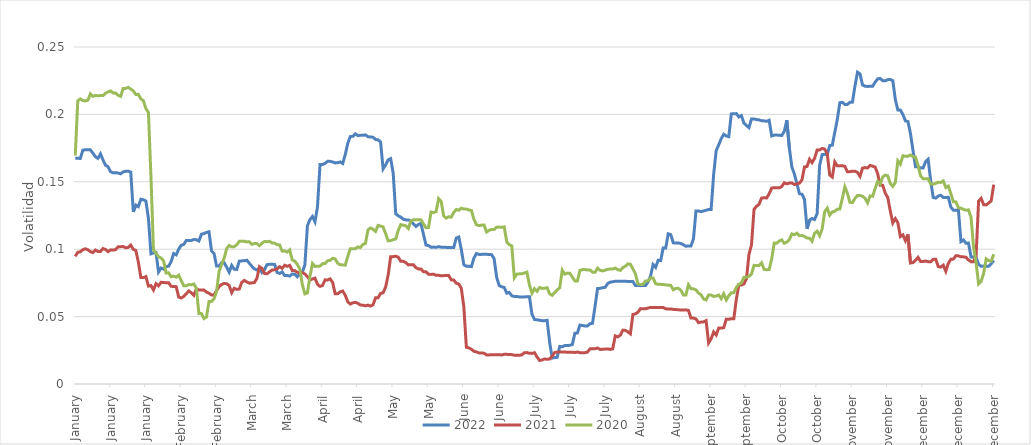
| Category | 2022 | 2021 | 2020 |
|---|---|---|---|
| 2021-01-01 | 0.167 | 0.095 | 0.17 |
| 2021-01-02 | 0.168 | 0.098 | 0.21 |
| 2021-01-03 | 0.167 | 0.098 | 0.212 |
| 2021-01-04 | 0.173 | 0.1 | 0.21 |
| 2021-01-05 | 0.174 | 0.1 | 0.21 |
| 2021-01-06 | 0.174 | 0.1 | 0.211 |
| 2021-01-07 | 0.174 | 0.098 | 0.215 |
| 2021-01-08 | 0.171 | 0.097 | 0.213 |
| 2021-01-09 | 0.169 | 0.099 | 0.214 |
| 2021-01-10 | 0.167 | 0.098 | 0.214 |
| 2021-01-11 | 0.171 | 0.098 | 0.214 |
| 2021-01-12 | 0.166 | 0.1 | 0.214 |
| 2021-01-13 | 0.162 | 0.1 | 0.216 |
| 2021-01-14 | 0.161 | 0.098 | 0.217 |
| 2021-01-15 | 0.157 | 0.099 | 0.217 |
| 2021-01-16 | 0.157 | 0.099 | 0.216 |
| 2021-01-17 | 0.157 | 0.1 | 0.216 |
| 2021-01-18 | 0.156 | 0.102 | 0.214 |
| 2021-01-19 | 0.156 | 0.102 | 0.213 |
| 2021-01-20 | 0.157 | 0.102 | 0.219 |
| 2021-01-21 | 0.158 | 0.101 | 0.219 |
| 2021-01-22 | 0.158 | 0.101 | 0.22 |
| 2021-01-23 | 0.157 | 0.103 | 0.219 |
| 2021-01-24 | 0.128 | 0.1 | 0.217 |
| 2021-01-25 | 0.133 | 0.099 | 0.215 |
| 2021-01-26 | 0.132 | 0.09 | 0.215 |
| 2021-01-27 | 0.137 | 0.079 | 0.211 |
| 2021-01-28 | 0.137 | 0.079 | 0.21 |
| 2021-01-29 | 0.136 | 0.08 | 0.204 |
| 2021-01-30 | 0.123 | 0.073 | 0.201 |
| 2021-01-31 | 0.097 | 0.073 | 0.154 |
| 2021-02-01 | 0.097 | 0.07 | 0.1 |
| 2021-02-02 | 0.098 | 0.074 | 0.097 |
| 2021-02-03 | 0.083 | 0.073 | 0.094 |
| 2021-02-04 | 0.086 | 0.075 | 0.093 |
| 2021-02-05 | 0.085 | 0.075 | 0.091 |
| 2021-02-06 | 0.087 | 0.075 | 0.082 |
| 2021-02-07 | 0.087 | 0.075 | 0.082 |
| 2021-02-08 | 0.091 | 0.073 | 0.08 |
| 2021-02-09 | 0.097 | 0.072 | 0.08 |
| 2021-02-10 | 0.096 | 0.072 | 0.079 |
| 2021-02-11 | 0.1 | 0.064 | 0.081 |
| 2021-02-12 | 0.103 | 0.064 | 0.077 |
| 2021-02-13 | 0.104 | 0.065 | 0.073 |
| 2021-02-14 | 0.106 | 0.067 | 0.073 |
| 2021-02-15 | 0.106 | 0.069 | 0.074 |
| 2021-02-16 | 0.106 | 0.068 | 0.074 |
| 2021-02-17 | 0.107 | 0.066 | 0.074 |
| 2021-02-18 | 0.107 | 0.071 | 0.071 |
| 2021-02-19 | 0.106 | 0.07 | 0.052 |
| 2021-02-20 | 0.111 | 0.07 | 0.052 |
| 2021-02-21 | 0.112 | 0.07 | 0.049 |
| 2021-02-22 | 0.112 | 0.068 | 0.05 |
| 2021-02-23 | 0.113 | 0.067 | 0.061 |
| 2021-02-24 | 0.099 | 0.066 | 0.061 |
| 2021-02-25 | 0.097 | 0.066 | 0.063 |
| 2021-02-26 | 0.088 | 0.069 | 0.069 |
| 2021-02-27 | 0.087 | 0.072 | 0.083 |
| 2021-02-28 | 0.09 | 0.074 | 0.089 |
| 2021-03-01 | 0.09 | 0.075 | 0.093 |
| 2021-03-02 | 0.087 | 0.074 | 0.1 |
| 2021-03-03 | 0.083 | 0.073 | 0.103 |
| 2021-03-04 | 0.088 | 0.068 | 0.102 |
| 2021-03-05 | 0.085 | 0.071 | 0.102 |
| 2021-03-06 | 0.085 | 0.07 | 0.103 |
| 2021-03-07 | 0.091 | 0.07 | 0.106 |
| 2021-03-08 | 0.091 | 0.075 | 0.106 |
| 2021-03-09 | 0.091 | 0.077 | 0.106 |
| 2021-03-10 | 0.092 | 0.076 | 0.105 |
| 2021-03-11 | 0.09 | 0.075 | 0.105 |
| 2021-03-12 | 0.087 | 0.075 | 0.104 |
| 2021-03-13 | 0.085 | 0.075 | 0.104 |
| 2021-03-14 | 0.085 | 0.078 | 0.104 |
| 2021-03-15 | 0.086 | 0.087 | 0.103 |
| 2021-03-16 | 0.083 | 0.086 | 0.104 |
| 2021-03-17 | 0.085 | 0.082 | 0.106 |
| 2021-03-18 | 0.089 | 0.082 | 0.106 |
| 2021-03-19 | 0.089 | 0.083 | 0.106 |
| 2021-03-20 | 0.089 | 0.085 | 0.105 |
| 2021-03-21 | 0.089 | 0.085 | 0.105 |
| 2021-03-22 | 0.083 | 0.085 | 0.103 |
| 2021-03-23 | 0.082 | 0.087 | 0.103 |
| 2021-03-24 | 0.083 | 0.086 | 0.099 |
| 2021-03-25 | 0.08 | 0.088 | 0.099 |
| 2021-03-26 | 0.08 | 0.087 | 0.098 |
| 2021-03-27 | 0.08 | 0.088 | 0.099 |
| 2021-03-28 | 0.082 | 0.084 | 0.092 |
| 2021-03-29 | 0.081 | 0.084 | 0.091 |
| 2021-03-30 | 0.08 | 0.083 | 0.089 |
| 2021-03-31 | 0.082 | 0.083 | 0.085 |
| 2021-04-01 | 0.083 | 0.083 | 0.074 |
| 2021-04-02 | 0.088 | 0.082 | 0.067 |
| 2021-04-03 | 0.117 | 0.08 | 0.068 |
| 2021-04-04 | 0.122 | 0.077 | 0.08 |
| 2021-04-05 | 0.124 | 0.078 | 0.089 |
| 2021-04-06 | 0.12 | 0.079 | 0.087 |
| 2021-04-07 | 0.132 | 0.074 | 0.087 |
| 2021-04-08 | 0.163 | 0.072 | 0.087 |
| 2021-04-09 | 0.163 | 0.073 | 0.089 |
| 2021-04-10 | 0.164 | 0.077 | 0.089 |
| 2021-04-11 | 0.165 | 0.077 | 0.091 |
| 2021-04-12 | 0.165 | 0.078 | 0.092 |
| 2021-04-13 | 0.165 | 0.075 | 0.093 |
| 2021-04-14 | 0.164 | 0.067 | 0.093 |
| 2021-04-15 | 0.164 | 0.067 | 0.09 |
| 2021-04-16 | 0.165 | 0.068 | 0.088 |
| 2021-04-17 | 0.164 | 0.069 | 0.088 |
| 2021-04-18 | 0.17 | 0.066 | 0.088 |
| 2021-04-19 | 0.179 | 0.061 | 0.095 |
| 2021-04-20 | 0.184 | 0.059 | 0.1 |
| 2021-04-21 | 0.184 | 0.06 | 0.1 |
| 2021-04-22 | 0.186 | 0.061 | 0.1 |
| 2021-04-23 | 0.184 | 0.06 | 0.102 |
| 2021-04-24 | 0.185 | 0.059 | 0.101 |
| 2021-04-25 | 0.184 | 0.058 | 0.104 |
| 2021-04-26 | 0.185 | 0.058 | 0.104 |
| 2021-04-27 | 0.183 | 0.059 | 0.114 |
| 2021-04-28 | 0.183 | 0.058 | 0.116 |
| 2021-04-29 | 0.183 | 0.059 | 0.115 |
| 2021-04-30 | 0.181 | 0.064 | 0.113 |
| 2021-05-01 | 0.181 | 0.064 | 0.118 |
| 2021-05-02 | 0.18 | 0.067 | 0.117 |
| 2021-05-03 | 0.16 | 0.068 | 0.117 |
| 2021-05-04 | 0.162 | 0.072 | 0.112 |
| 2021-05-05 | 0.166 | 0.081 | 0.106 |
| 2021-05-06 | 0.167 | 0.094 | 0.106 |
| 2021-05-07 | 0.156 | 0.094 | 0.107 |
| 2021-05-08 | 0.126 | 0.095 | 0.108 |
| 2021-05-09 | 0.125 | 0.094 | 0.114 |
| 2021-05-10 | 0.124 | 0.091 | 0.118 |
| 2021-05-11 | 0.122 | 0.091 | 0.118 |
| 2021-05-12 | 0.122 | 0.09 | 0.117 |
| 2021-05-13 | 0.122 | 0.088 | 0.115 |
| 2021-05-14 | 0.121 | 0.088 | 0.121 |
| 2021-05-15 | 0.119 | 0.089 | 0.122 |
| 2021-05-16 | 0.117 | 0.086 | 0.122 |
| 2021-05-17 | 0.118 | 0.085 | 0.122 |
| 2021-05-18 | 0.119 | 0.085 | 0.122 |
| 2021-05-19 | 0.111 | 0.083 | 0.119 |
| 2021-05-20 | 0.103 | 0.083 | 0.116 |
| 2021-05-21 | 0.103 | 0.081 | 0.116 |
| 2021-05-22 | 0.101 | 0.081 | 0.128 |
| 2021-05-23 | 0.102 | 0.081 | 0.127 |
| 2021-05-24 | 0.101 | 0.081 | 0.128 |
| 2021-05-25 | 0.102 | 0.081 | 0.138 |
| 2021-05-26 | 0.101 | 0.08 | 0.136 |
| 2021-05-27 | 0.101 | 0.08 | 0.125 |
| 2021-05-28 | 0.101 | 0.081 | 0.123 |
| 2021-05-29 | 0.101 | 0.081 | 0.124 |
| 2021-05-30 | 0.101 | 0.077 | 0.124 |
| 2021-05-31 | 0.101 | 0.077 | 0.127 |
| 2021-06-01 | 0.108 | 0.075 | 0.129 |
| 2021-06-02 | 0.109 | 0.074 | 0.129 |
| 2021-06-03 | 0.1 | 0.071 | 0.13 |
| 2021-06-04 | 0.088 | 0.057 | 0.13 |
| 2021-06-05 | 0.087 | 0.027 | 0.13 |
| 2021-06-06 | 0.087 | 0.027 | 0.129 |
| 2021-06-07 | 0.087 | 0.026 | 0.129 |
| 2021-06-08 | 0.093 | 0.024 | 0.122 |
| 2021-06-09 | 0.097 | 0.024 | 0.118 |
| 2021-06-10 | 0.096 | 0.023 | 0.118 |
| 2021-06-11 | 0.096 | 0.023 | 0.118 |
| 2021-06-12 | 0.096 | 0.023 | 0.118 |
| 2021-06-13 | 0.096 | 0.022 | 0.113 |
| 2021-06-14 | 0.096 | 0.022 | 0.114 |
| 2021-06-15 | 0.096 | 0.022 | 0.115 |
| 2021-06-16 | 0.093 | 0.022 | 0.115 |
| 2021-06-17 | 0.079 | 0.022 | 0.116 |
| 2021-06-18 | 0.073 | 0.022 | 0.116 |
| 2021-06-19 | 0.072 | 0.022 | 0.116 |
| 2021-06-20 | 0.072 | 0.022 | 0.117 |
| 2021-06-21 | 0.067 | 0.022 | 0.105 |
| 2021-06-22 | 0.068 | 0.022 | 0.103 |
| 2021-06-23 | 0.065 | 0.022 | 0.102 |
| 2021-06-24 | 0.065 | 0.021 | 0.079 |
| 2021-06-25 | 0.065 | 0.021 | 0.081 |
| 2021-06-26 | 0.065 | 0.021 | 0.082 |
| 2021-06-27 | 0.065 | 0.022 | 0.082 |
| 2021-06-28 | 0.065 | 0.023 | 0.082 |
| 2021-06-29 | 0.065 | 0.023 | 0.083 |
| 2021-06-30 | 0.065 | 0.023 | 0.073 |
| 2021-07-01 | 0.052 | 0.023 | 0.067 |
| 2021-07-02 | 0.048 | 0.023 | 0.071 |
| 2021-07-03 | 0.048 | 0.02 | 0.069 |
| 2021-07-04 | 0.047 | 0.017 | 0.072 |
| 2021-07-05 | 0.047 | 0.018 | 0.071 |
| 2021-07-06 | 0.047 | 0.019 | 0.071 |
| 2021-07-07 | 0.047 | 0.018 | 0.071 |
| 2021-07-08 | 0.031 | 0.019 | 0.067 |
| 2021-07-09 | 0.019 | 0.021 | 0.066 |
| 2021-07-10 | 0.02 | 0.023 | 0.068 |
| 2021-07-11 | 0.02 | 0.024 | 0.07 |
| 2021-07-12 | 0.028 | 0.024 | 0.071 |
| 2021-07-13 | 0.028 | 0.024 | 0.084 |
| 2021-07-14 | 0.028 | 0.024 | 0.082 |
| 2021-07-15 | 0.029 | 0.024 | 0.082 |
| 2021-07-16 | 0.029 | 0.024 | 0.082 |
| 2021-07-17 | 0.029 | 0.024 | 0.079 |
| 2021-07-18 | 0.038 | 0.023 | 0.076 |
| 2021-07-19 | 0.038 | 0.024 | 0.076 |
| 2021-07-20 | 0.044 | 0.023 | 0.084 |
| 2021-07-21 | 0.043 | 0.023 | 0.085 |
| 2021-07-22 | 0.043 | 0.023 | 0.085 |
| 2021-07-23 | 0.043 | 0.024 | 0.085 |
| 2021-07-24 | 0.045 | 0.026 | 0.085 |
| 2021-07-25 | 0.045 | 0.026 | 0.083 |
| 2021-07-26 | 0.058 | 0.026 | 0.083 |
| 2021-07-27 | 0.071 | 0.027 | 0.086 |
| 2021-07-28 | 0.071 | 0.026 | 0.084 |
| 2021-07-29 | 0.071 | 0.026 | 0.084 |
| 2021-07-30 | 0.072 | 0.026 | 0.084 |
| 2021-07-31 | 0.075 | 0.026 | 0.085 |
| 2021-08-01 | 0.076 | 0.026 | 0.085 |
| 2021-08-02 | 0.076 | 0.026 | 0.085 |
| 2021-08-03 | 0.076 | 0.036 | 0.086 |
| 2021-08-04 | 0.076 | 0.035 | 0.085 |
| 2021-08-05 | 0.076 | 0.036 | 0.084 |
| 2021-08-06 | 0.076 | 0.04 | 0.086 |
| 2021-08-07 | 0.076 | 0.04 | 0.087 |
| 2021-08-08 | 0.076 | 0.039 | 0.089 |
| 2021-08-09 | 0.076 | 0.037 | 0.089 |
| 2021-08-10 | 0.076 | 0.052 | 0.085 |
| 2021-08-11 | 0.073 | 0.052 | 0.082 |
| 2021-08-12 | 0.073 | 0.053 | 0.074 |
| 2021-08-13 | 0.073 | 0.056 | 0.074 |
| 2021-08-14 | 0.073 | 0.056 | 0.074 |
| 2021-08-15 | 0.073 | 0.056 | 0.076 |
| 2021-08-16 | 0.076 | 0.056 | 0.076 |
| 2021-08-17 | 0.08 | 0.057 | 0.079 |
| 2021-08-18 | 0.089 | 0.057 | 0.079 |
| 2021-08-19 | 0.086 | 0.057 | 0.074 |
| 2021-08-20 | 0.092 | 0.057 | 0.074 |
| 2021-08-21 | 0.092 | 0.057 | 0.074 |
| 2021-08-22 | 0.101 | 0.057 | 0.074 |
| 2021-08-23 | 0.101 | 0.056 | 0.074 |
| 2021-08-24 | 0.111 | 0.056 | 0.073 |
| 2021-08-25 | 0.111 | 0.056 | 0.073 |
| 2021-08-26 | 0.105 | 0.055 | 0.07 |
| 2021-08-27 | 0.105 | 0.055 | 0.071 |
| 2021-08-28 | 0.105 | 0.055 | 0.071 |
| 2021-08-29 | 0.104 | 0.055 | 0.07 |
| 2021-08-30 | 0.103 | 0.055 | 0.066 |
| 2021-08-31 | 0.102 | 0.055 | 0.066 |
| 2021-09-01 | 0.102 | 0.055 | 0.074 |
| 2021-09-02 | 0.102 | 0.049 | 0.071 |
| 2021-09-03 | 0.108 | 0.049 | 0.071 |
| 2021-09-04 | 0.128 | 0.048 | 0.07 |
| 2021-09-05 | 0.128 | 0.046 | 0.067 |
| 2021-09-06 | 0.128 | 0.046 | 0.066 |
| 2021-09-07 | 0.128 | 0.046 | 0.063 |
| 2021-09-08 | 0.129 | 0.047 | 0.062 |
| 2021-09-09 | 0.129 | 0.03 | 0.066 |
| 2021-09-10 | 0.129 | 0.034 | 0.066 |
| 2021-09-11 | 0.156 | 0.039 | 0.065 |
| 2021-09-12 | 0.173 | 0.036 | 0.065 |
| 2021-09-13 | 0.177 | 0.041 | 0.066 |
| 2021-09-14 | 0.182 | 0.041 | 0.063 |
| 2021-09-15 | 0.185 | 0.042 | 0.067 |
| 2021-09-16 | 0.184 | 0.048 | 0.062 |
| 2021-09-17 | 0.183 | 0.048 | 0.065 |
| 2021-09-18 | 0.2 | 0.048 | 0.068 |
| 2021-09-19 | 0.2 | 0.048 | 0.068 |
| 2021-09-20 | 0.201 | 0.063 | 0.072 |
| 2021-09-21 | 0.198 | 0.074 | 0.074 |
| 2021-09-22 | 0.199 | 0.073 | 0.075 |
| 2021-09-23 | 0.194 | 0.074 | 0.079 |
| 2021-09-24 | 0.192 | 0.078 | 0.079 |
| 2021-09-25 | 0.19 | 0.096 | 0.08 |
| 2021-09-26 | 0.197 | 0.103 | 0.082 |
| 2021-09-27 | 0.197 | 0.13 | 0.088 |
| 2021-09-28 | 0.196 | 0.132 | 0.088 |
| 2021-09-29 | 0.196 | 0.133 | 0.088 |
| 2021-09-30 | 0.195 | 0.138 | 0.09 |
| 2021-10-01 | 0.195 | 0.138 | 0.085 |
| 2021-10-02 | 0.195 | 0.138 | 0.085 |
| 2021-10-03 | 0.196 | 0.141 | 0.085 |
| 2021-10-04 | 0.184 | 0.145 | 0.093 |
| 2021-10-05 | 0.185 | 0.146 | 0.105 |
| 2021-10-06 | 0.185 | 0.146 | 0.104 |
| 2021-10-07 | 0.185 | 0.146 | 0.106 |
| 2021-10-08 | 0.184 | 0.146 | 0.107 |
| 2021-10-09 | 0.187 | 0.149 | 0.104 |
| 2021-10-10 | 0.196 | 0.148 | 0.105 |
| 2021-10-11 | 0.175 | 0.149 | 0.107 |
| 2021-10-12 | 0.161 | 0.149 | 0.111 |
| 2021-10-13 | 0.156 | 0.148 | 0.111 |
| 2021-10-14 | 0.149 | 0.148 | 0.112 |
| 2021-10-15 | 0.141 | 0.149 | 0.11 |
| 2021-10-16 | 0.141 | 0.151 | 0.11 |
| 2021-10-17 | 0.137 | 0.161 | 0.109 |
| 2021-10-18 | 0.115 | 0.161 | 0.108 |
| 2021-10-19 | 0.121 | 0.167 | 0.108 |
| 2021-10-20 | 0.123 | 0.164 | 0.106 |
| 2021-10-21 | 0.122 | 0.167 | 0.112 |
| 2021-10-22 | 0.126 | 0.174 | 0.113 |
| 2021-10-23 | 0.162 | 0.174 | 0.11 |
| 2021-10-24 | 0.17 | 0.175 | 0.115 |
| 2021-10-25 | 0.17 | 0.174 | 0.128 |
| 2021-10-26 | 0.17 | 0.171 | 0.13 |
| 2021-10-27 | 0.177 | 0.155 | 0.125 |
| 2021-10-28 | 0.177 | 0.154 | 0.128 |
| 2021-10-29 | 0.187 | 0.165 | 0.128 |
| 2021-10-30 | 0.196 | 0.162 | 0.13 |
| 2021-10-31 | 0.209 | 0.162 | 0.13 |
| 2021-11-01 | 0.209 | 0.162 | 0.138 |
| 2021-11-02 | 0.207 | 0.161 | 0.146 |
| 2021-11-03 | 0.207 | 0.157 | 0.142 |
| 2021-11-04 | 0.209 | 0.158 | 0.135 |
| 2021-11-05 | 0.209 | 0.158 | 0.135 |
| 2021-11-06 | 0.221 | 0.158 | 0.138 |
| 2021-11-07 | 0.231 | 0.157 | 0.14 |
| 2021-11-08 | 0.23 | 0.154 | 0.14 |
| 2021-11-09 | 0.222 | 0.16 | 0.139 |
| 2021-11-10 | 0.221 | 0.161 | 0.138 |
| 2021-11-11 | 0.221 | 0.16 | 0.134 |
| 2021-11-12 | 0.221 | 0.162 | 0.14 |
| 2021-11-13 | 0.221 | 0.162 | 0.139 |
| 2021-11-14 | 0.224 | 0.161 | 0.145 |
| 2021-11-15 | 0.226 | 0.156 | 0.15 |
| 2021-11-16 | 0.227 | 0.147 | 0.148 |
| 2021-11-17 | 0.225 | 0.147 | 0.154 |
| 2021-11-18 | 0.225 | 0.142 | 0.155 |
| 2021-11-19 | 0.226 | 0.138 | 0.154 |
| 2021-11-20 | 0.226 | 0.128 | 0.149 |
| 2021-11-21 | 0.225 | 0.12 | 0.147 |
| 2021-11-22 | 0.211 | 0.123 | 0.149 |
| 2021-11-23 | 0.203 | 0.12 | 0.166 |
| 2021-11-24 | 0.203 | 0.109 | 0.163 |
| 2021-11-25 | 0.2 | 0.111 | 0.169 |
| 2021-11-26 | 0.195 | 0.106 | 0.169 |
| 2021-11-27 | 0.195 | 0.111 | 0.169 |
| 2021-11-28 | 0.186 | 0.09 | 0.17 |
| 2021-11-29 | 0.173 | 0.09 | 0.169 |
| 2021-11-30 | 0.161 | 0.092 | 0.168 |
| 2021-12-01 | 0.161 | 0.094 | 0.162 |
| 2021-12-02 | 0.16 | 0.091 | 0.154 |
| 2021-12-03 | 0.16 | 0.091 | 0.152 |
| 2021-12-04 | 0.165 | 0.091 | 0.152 |
| 2021-12-05 | 0.167 | 0.091 | 0.152 |
| 2021-12-06 | 0.151 | 0.091 | 0.148 |
| 2021-12-07 | 0.138 | 0.092 | 0.148 |
| 2021-12-08 | 0.138 | 0.093 | 0.149 |
| 2021-12-09 | 0.139 | 0.087 | 0.15 |
| 2021-12-10 | 0.14 | 0.087 | 0.15 |
| 2021-12-11 | 0.138 | 0.088 | 0.151 |
| 2021-12-12 | 0.138 | 0.084 | 0.146 |
| 2021-12-13 | 0.139 | 0.089 | 0.147 |
| 2021-12-14 | 0.131 | 0.093 | 0.141 |
| 2021-12-15 | 0.129 | 0.093 | 0.135 |
| 2021-12-16 | 0.129 | 0.095 | 0.135 |
| 2021-12-17 | 0.129 | 0.095 | 0.131 |
| 2021-12-18 | 0.106 | 0.094 | 0.13 |
| 2021-12-19 | 0.107 | 0.094 | 0.13 |
| 2021-12-20 | 0.104 | 0.094 | 0.129 |
| 2021-12-21 | 0.105 | 0.092 | 0.129 |
| 2021-12-22 | 0.094 | 0.091 | 0.124 |
| 2021-12-23 | 0.094 | 0.091 | 0.102 |
| 2021-12-24 | 0.094 | 0.095 | 0.09 |
| 2021-12-25 | 0.089 | 0.136 | 0.074 |
| 2021-12-26 | 0.087 | 0.138 | 0.076 |
| 2021-12-27 | 0.088 | 0.133 | 0.082 |
| 2021-12-28 | 0.087 | 0.133 | 0.093 |
| 2021-12-29 | 0.087 | 0.134 | 0.092 |
| 2021-12-30 | 0.089 | 0.136 | 0.091 |
| 2021-12-31 | 0.092 | 0.148 | 0.096 |